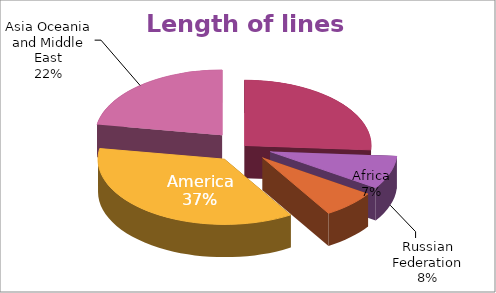
| Category | Series 0 |
|---|---|
| Europe  * | 265119.558 |
| Russian Federation | 84249 |
| Africa | 70504.64 |
| America | 369222 |
| Asia Oceania and Middle East | 227721.97 |